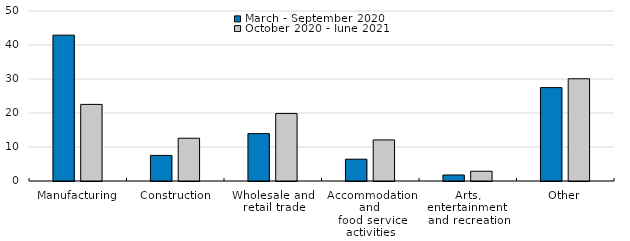
| Category | March - September 2020 | October 2020 - June 2021 |
|---|---|---|
| Manufacturing | 42.896 | 22.528 |
| Construction | 7.526 | 12.579 |
| Wholesale and 
retail trade | 13.934 | 19.864 |
| Accommodation and 
food service activities | 6.409 | 12.089 |
| Arts, entertainment 
and recreation | 1.769 | 2.87 |
| Other | 27.466 | 30.07 |